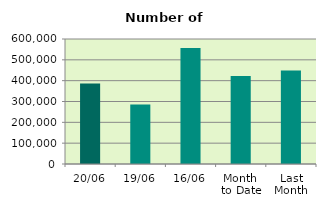
| Category | Series 0 |
|---|---|
| 20/06 | 386962 |
| 19/06 | 286048 |
| 16/06 | 556952 |
| Month 
to Date | 422276.714 |
| Last
Month | 449234.545 |